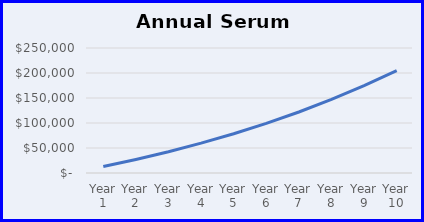
| Category | Series 0 |
|---|---|
| Year 1 | 12859.844 |
| Year 2 | 27005.672 |
| Year 3 | 42566.083 |
| Year 4 | 59682.535 |
| Year 5 | 78510.632 |
| Year 6 | 99221.539 |
| Year 7 | 122003.537 |
| Year 8 | 147063.734 |
| Year 9 | 174629.951 |
| Year 10 | 204952.79 |